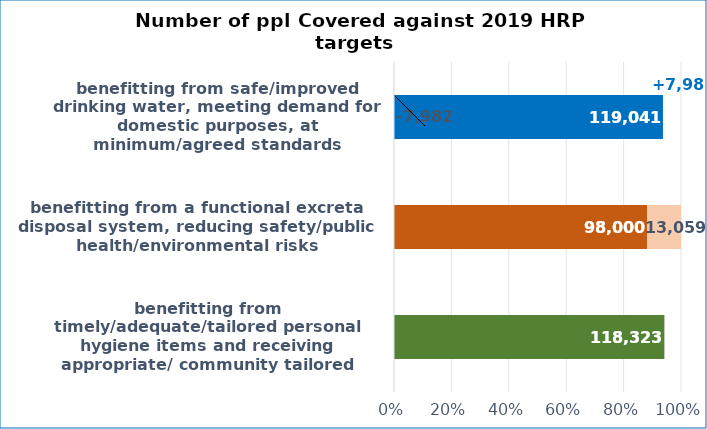
| Category | Coverage | Gap |
|---|---|---|
| benefitting from timely/adequate/tailored personal hygiene items and receiving appropriate/ community tailored messages that enable health seeking behavior | 118323 | -7264 |
| benefitting from a functional excreta disposal system, reducing safety/public health/environmental risks | 98000 | 13059 |
| benefitting from safe/improved drinking water, meeting demand for domestic purposes, at minimum/agreed standards | 119041 | -7982 |